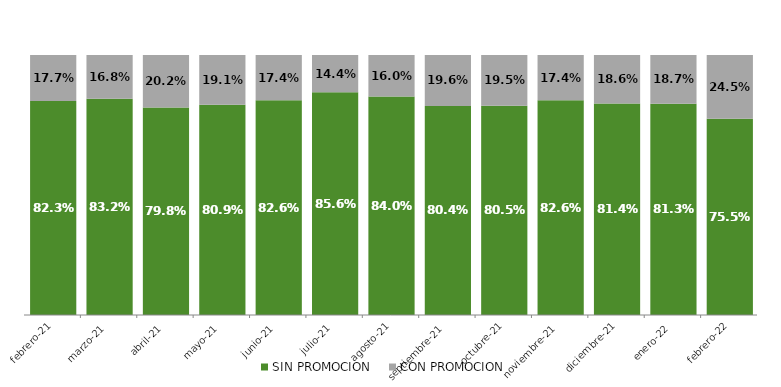
| Category | SIN PROMOCION   | CON PROMOCION   |
|---|---|---|
| 2021-02-01 | 0.823 | 0.177 |
| 2021-03-01 | 0.832 | 0.168 |
| 2021-04-01 | 0.798 | 0.202 |
| 2021-05-01 | 0.809 | 0.191 |
| 2021-06-01 | 0.826 | 0.174 |
| 2021-07-01 | 0.856 | 0.144 |
| 2021-08-01 | 0.84 | 0.16 |
| 2021-09-01 | 0.804 | 0.196 |
| 2021-10-01 | 0.805 | 0.195 |
| 2021-11-01 | 0.826 | 0.174 |
| 2021-12-01 | 0.814 | 0.186 |
| 2022-01-01 | 0.813 | 0.187 |
| 2022-02-01 | 0.755 | 0.245 |